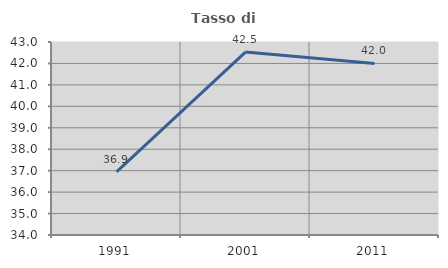
| Category | Tasso di occupazione   |
|---|---|
| 1991.0 | 36.94 |
| 2001.0 | 42.529 |
| 2011.0 | 42 |